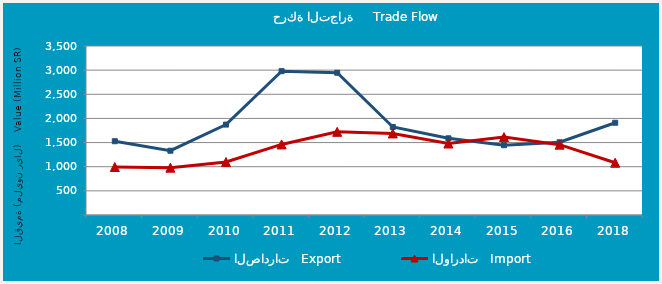
| Category | الصادرات   Export | الواردات   Import |
|---|---|---|
| 2008.0 | 1527858212 | 993935543 |
| 2009.0 | 1331023979 | 980251837 |
| 2010.0 | 1872544592 | 1096963944 |
| 2011.0 | 2978607759 | 1461837415 |
| 2012.0 | 2946562908 | 1722646066 |
| 2013.0 | 1823065192 | 1689339070 |
| 2014.0 | 1588337909 | 1480564629 |
| 2015.0 | 1444633704 | 1613279912 |
| 2016.0 | 1506429749 | 1456751612 |
| 2018.0 | 1910463868 | 1082135045 |